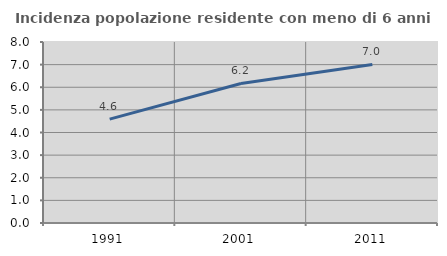
| Category | Incidenza popolazione residente con meno di 6 anni |
|---|---|
| 1991.0 | 4.59 |
| 2001.0 | 6.166 |
| 2011.0 | 7.01 |